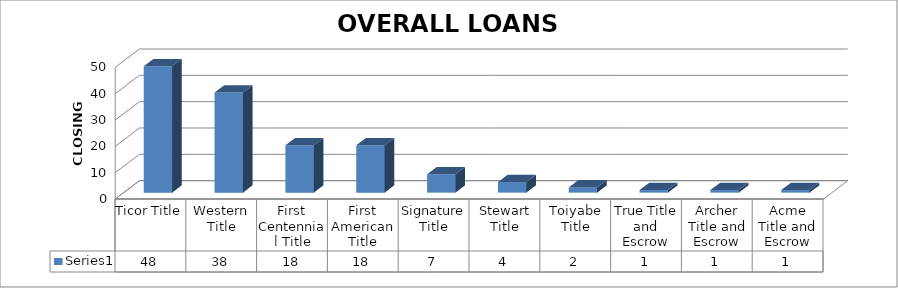
| Category | Series 0 |
|---|---|
| Ticor Title | 48 |
| Western Title | 38 |
| First Centennial Title | 18 |
| First American Title | 18 |
| Signature Title | 7 |
| Stewart Title | 4 |
| Toiyabe Title | 2 |
| True Title and Escrow | 1 |
| Archer Title and Escrow | 1 |
| Acme Title and Escrow | 1 |